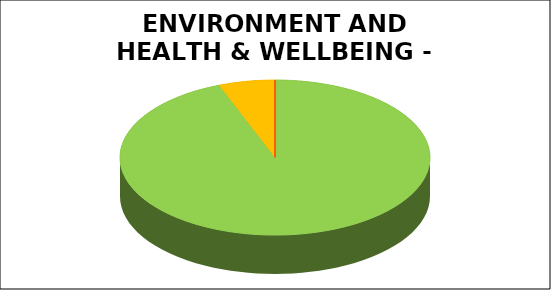
| Category | Series 0 |
|---|---|
| Green | 0.941 |
| Amber | 0.059 |
| Red | 0 |